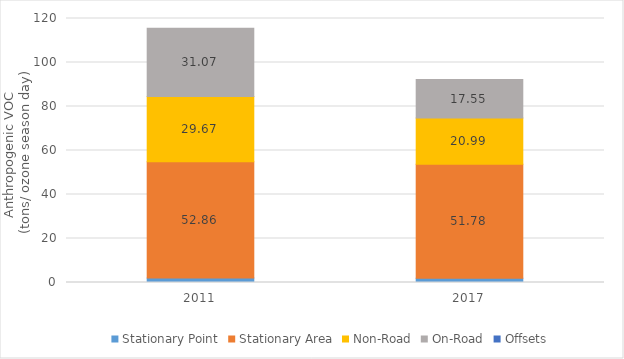
| Category | Stationary Point | Stationary Area | Non-Road | On-Road | Offsets |
|---|---|---|---|---|---|
| 2011.0 | 1.991 | 52.862 | 29.666 | 31.07 | 0 |
| 2017.0 | 1.964 | 51.782 | 20.994 | 17.552 | 0 |